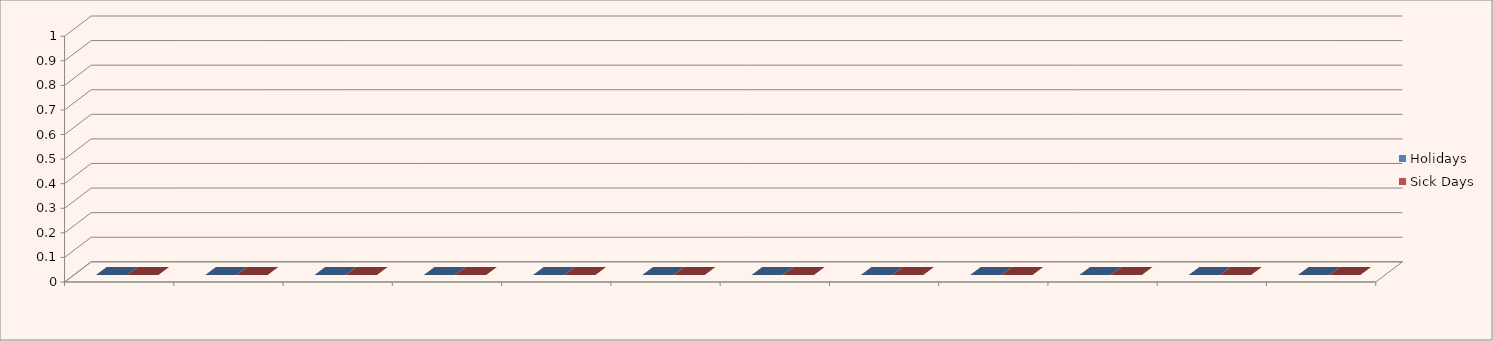
| Category | Holidays | Sick Days |
|---|---|---|
| 0 | 0 | 0 |
| 1 | 0 | 0 |
| 2 | 0 | 0 |
| 3 | 0 | 0 |
| 4 | 0 | 0 |
| 5 | 0 | 0 |
| 6 | 0 | 0 |
| 7 | 0 | 0 |
| 8 | 0 | 0 |
| 9 | 0 | 0 |
| 10 | 0 | 0 |
| 11 | 0 | 0 |